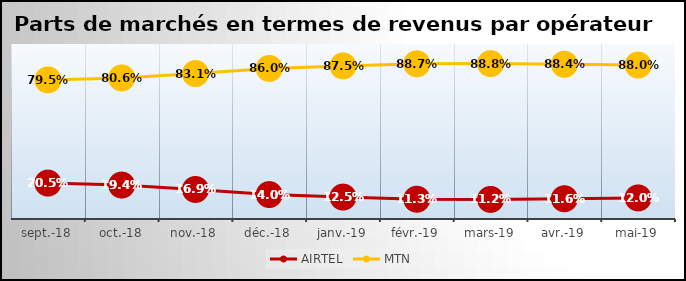
| Category | AIRTEL | MTN |
|---|---|---|
| 2018-09-01 | 0.205 | 0.795 |
| 2018-10-01 | 0.194 | 0.806 |
| 2018-11-01 | 0.169 | 0.831 |
| 2018-12-01 | 0.14 | 0.86 |
| 2019-01-01 | 0.125 | 0.875 |
| 2019-02-01 | 0.113 | 0.887 |
| 2019-03-01 | 0.112 | 0.888 |
| 2019-04-01 | 0.116 | 0.884 |
| 2019-05-01 | 0.12 | 0.88 |